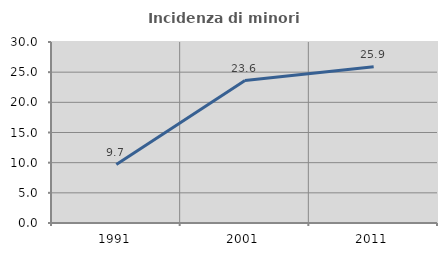
| Category | Incidenza di minori stranieri |
|---|---|
| 1991.0 | 9.677 |
| 2001.0 | 23.615 |
| 2011.0 | 25.908 |